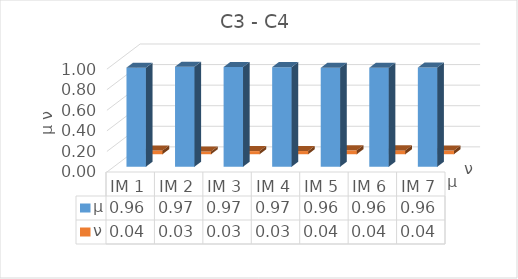
| Category | μ | ν |
|---|---|---|
| IM 1 | 0.964 | 0.036 |
| IM 2 | 0.973 | 0.027 |
| IM 3 | 0.97 | 0.03 |
| IM 4 | 0.969 | 0.031 |
| IM 5 | 0.962 | 0.038 |
| IM 6 | 0.963 | 0.037 |
| IM 7 | 0.964 | 0.036 |